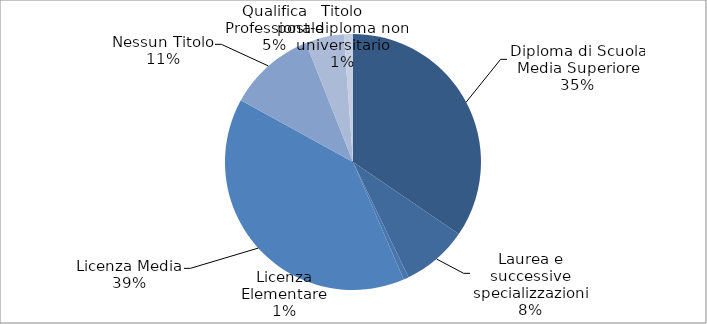
| Category | Series 0 |
|---|---|
| Diploma di Scuola Media Superiore | 0.341 |
| Laurea e successive specializzazioni | 0.082 |
| Licenza Elementare | 0.007 |
| Licenza Media | 0.39 |
| Nessun Titolo | 0.109 |
| Qualifica Professionale | 0.048 |
| Titolo post-diploma non universitario | 0.011 |